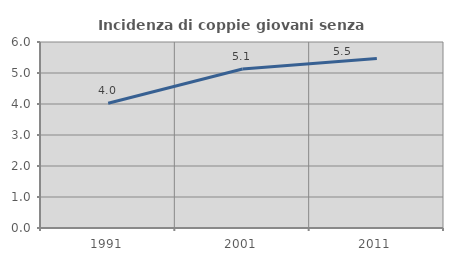
| Category | Incidenza di coppie giovani senza figli |
|---|---|
| 1991.0 | 4.023 |
| 2001.0 | 5.128 |
| 2011.0 | 5.469 |